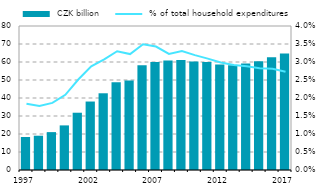
| Category |  CZK billion |
|---|---|
| 1997.0 | 18.319 |
| 1998.0 | 19.046 |
| 1999.0 | 21.046 |
| 2000.0 | 24.782 |
| 2001.0 | 31.82 |
| 2002.0 | 38.038 |
| 2003.0 | 42.624 |
| 2004.0 | 48.765 |
| 2005.0 | 49.657 |
| 2006.0 | 58.175 |
| 2007.0 | 60.049 |
| 2008.0 | 60.854 |
| 2009.0 | 61.08 |
| 2010.0 | 60.266 |
| 2011.0 | 59.982 |
| 2012.0 | 58.552 |
| 2013.0 | 58.226 |
| 2014.0 | 59.202 |
| 2015.0 | 60.464 |
| 2016.0 | 62.573 |
| 2017.0 | 64.78 |